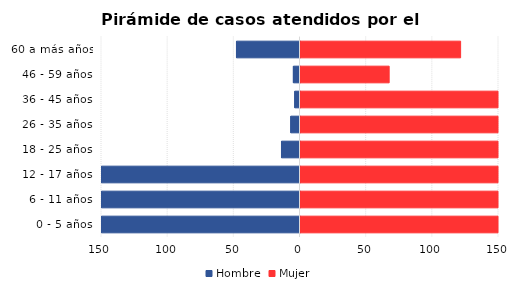
| Category | Hombre | Mujer |
|---|---|---|
| 0 - 5 años | -446 | 528 |
| 6 - 11 años | -576 | 711 |
| 12 - 17 años | -284 | 818 |
| 18 - 25 años | -14 | 271 |
| 26 - 35 años | -7 | 272 |
| 36 - 45 años | -4 | 174 |
| 46 - 59 años | -5 | 67 |
| 60 a más años | -48 | 121 |